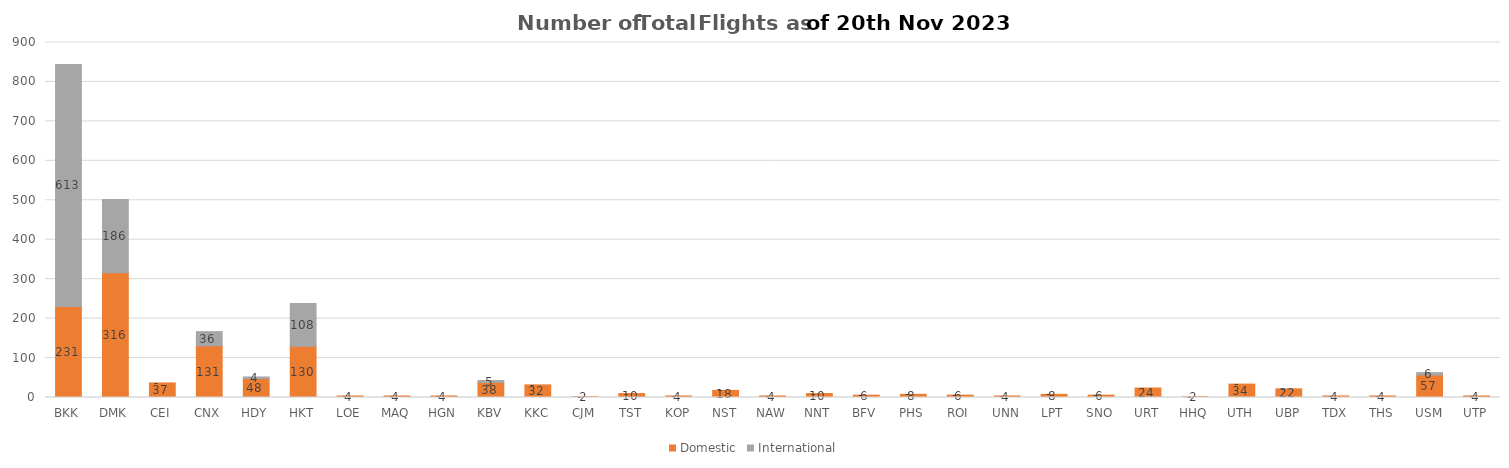
| Category | Domestic | International |
|---|---|---|
| BKK | 231 | 613 |
| DMK | 316 | 186 |
| CEI | 37 | 0 |
| CNX | 131 | 36 |
| HDY | 48 | 4 |
| HKT | 130 | 108 |
| LOE | 4 | 0 |
| MAQ | 4 | 0 |
| HGN | 4 | 0 |
| KBV | 38 | 5 |
| KKC | 32 | 0 |
| CJM | 2 | 0 |
| TST | 10 | 0 |
| KOP | 4 | 0 |
| NST | 18 | 0 |
| NAW | 4 | 0 |
| NNT | 10 | 0 |
| BFV | 6 | 0 |
| PHS | 8 | 0 |
| ROI | 6 | 0 |
| UNN | 4 | 0 |
| LPT | 8 | 0 |
| SNO | 6 | 0 |
| URT | 24 | 0 |
| HHQ | 2 | 0 |
| UTH | 34 | 0 |
| UBP | 22 | 0 |
| TDX | 4 | 0 |
| THS | 4 | 0 |
| USM | 57 | 6 |
| UTP | 4 | 0 |